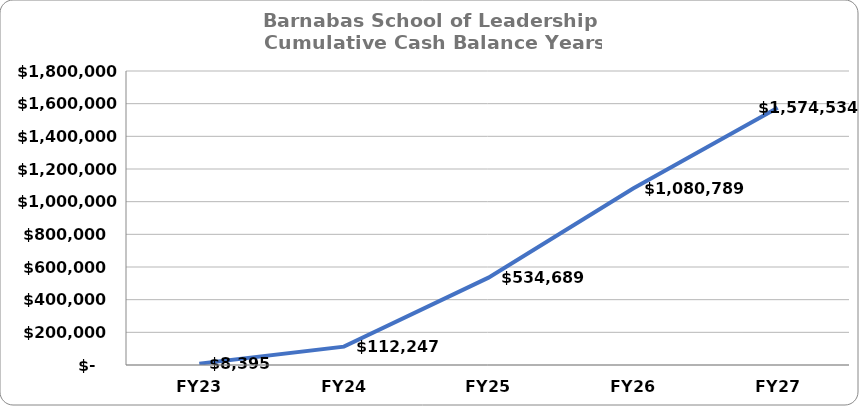
| Category | Estimated Cash Balance  |
|---|---|
| FY23 | 8395 |
| FY24 | 112246.588 |
| FY25 | 534689.462 |
| FY26 | 1080788.73 |
| FY27 | 1574534.433 |